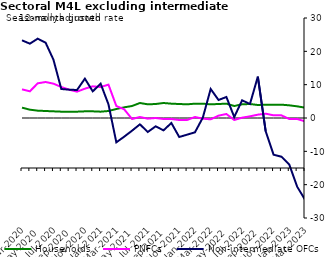
| Category | zero | Households | PNFCs | Non-intermediate OFCs |
|---|---|---|---|---|
| Mar-2020 | 0 | 3.1 | 8.6 | 23.3 |
| Apr-2020 | 0 | 2.5 | 8 | 22.3 |
| May-2020 | 0 | 2.2 | 10.4 | 23.8 |
| Jun-2020 | 0 | 2.1 | 10.8 | 22.6 |
| Jul-2020 | 0 | 2 | 10.3 | 17.5 |
| Aug-2020 | 0 | 1.9 | 9.3 | 8.7 |
| Sep-2020 | 0 | 1.9 | 8.5 | 8.5 |
| Oct-2020 | 0 | 1.9 | 7.9 | 8.4 |
| Nov-2020 | 0 | 2 | 8.8 | 11.8 |
| Dec-2020 | 0 | 2 | 9.5 | 8 |
| Jan-2021 | 0 | 1.9 | 9.3 | 10.3 |
| Feb-2021 | 0 | 2.1 | 10 | 4.1 |
| Mar-2021 | 0 | 2.7 | 3.6 | -7.3 |
| Apr-2021 | 0 | 3.2 | 2.6 | -5.6 |
| May-2021 | 0 | 3.6 | -0.3 | -3.8 |
| Jun-2021 | 0 | 4.5 | 0.3 | -1.9 |
| Jul-2021 | 0 | 4.1 | -0.2 | -4.2 |
| Aug-2021 | 0 | 4.2 | 0 | -2.5 |
| Sep-2021 | 0 | 4.5 | -0.3 | -3.7 |
| Oct-2021 | 0 | 4.3 | -0.3 | -1.5 |
| Nov-2021 | 0 | 4.2 | -0.6 | -5.7 |
| Dec-2021 | 0 | 4.1 | -0.6 | -5 |
| Jan-2022 | 0 | 4.3 | 0.3 | -4.3 |
| Feb-2022 | 0 | 4.3 | -0.2 | 0.1 |
| Mar-2022 | 0 | 4.1 | -0.4 | 8.7 |
| Apr-2022 | 0 | 4.2 | 0.7 | 5.4 |
| May-2022 | 0 | 4.3 | 1.2 | 6.3 |
| Jun-2022 | 0 | 3.6 | -0.6 | 0.3 |
| Jul-2022 | 0 | 4.1 | 0.1 | 5.3 |
| Aug-2022 | 0 | 4.2 | 0.5 | 4.2 |
| Sep-2022 | 0 | 3.9 | 1 | 12.4 |
| Oct-2022 | 0 | 4 | 1.3 | -4 |
| Nov-2022 | 0 | 4 | 0.8 | -11 |
| Dec-2022 | 0 | 4 | 0.8 | -11.6 |
| Jan-2023 | 0 | 3.8 | -0.3 | -14 |
| Feb-2023 | 0 | 3.5 | -0.3 | -20.6 |
| Mar-2023 | 0 | 3.1 | -1 | -24.5 |